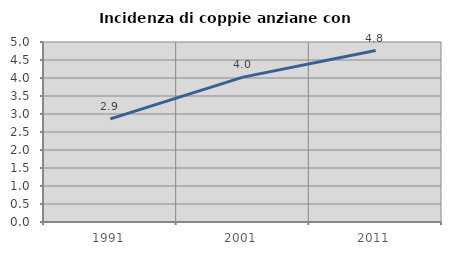
| Category | Incidenza di coppie anziane con figli |
|---|---|
| 1991.0 | 2.866 |
| 2001.0 | 4.025 |
| 2011.0 | 4.762 |